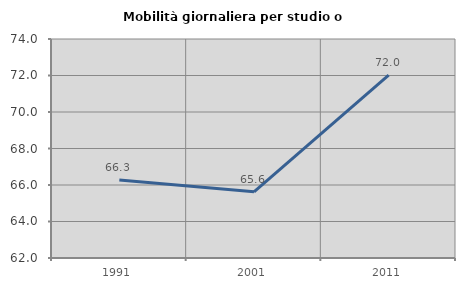
| Category | Mobilità giornaliera per studio o lavoro |
|---|---|
| 1991.0 | 66.268 |
| 2001.0 | 65.626 |
| 2011.0 | 72.024 |